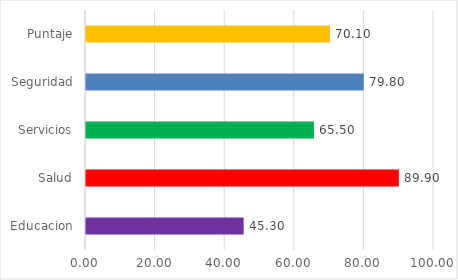
| Category | Series 0 |
|---|---|
| Educacion | 45.3 |
| Salud | 89.9 |
| Servicios | 65.5 |
| Seguridad | 79.8 |
| Puntaje | 70.1 |